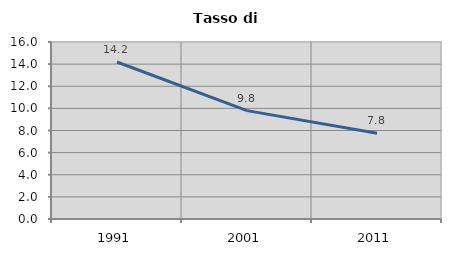
| Category | Tasso di disoccupazione   |
|---|---|
| 1991.0 | 14.192 |
| 2001.0 | 9.795 |
| 2011.0 | 7.753 |